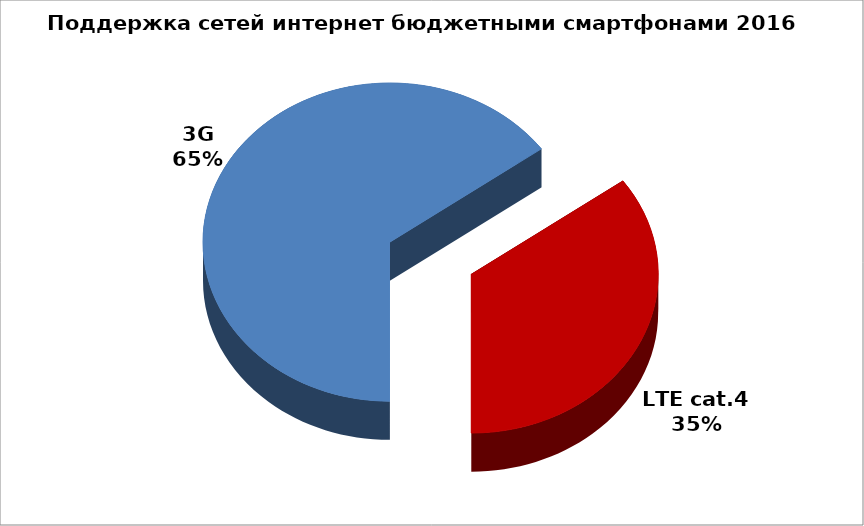
| Category | Series 0 |
|---|---|
| 3G | 106 |
| LTE cat.4 | 57 |